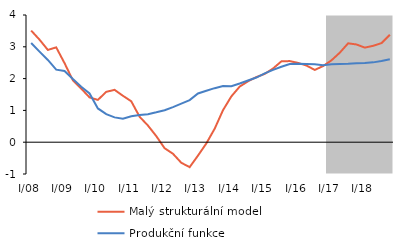
| Category | Malý strukturální model | Produkční funkce |
|---|---|---|
| I/08 | 3.51 | 3.12 |
| II | 3.225 | 2.848 |
| III | 2.902 | 2.586 |
| IV | 2.983 | 2.28 |
| I/09 | 2.486 | 2.239 |
| II | 1.945 | 1.986 |
| III | 1.685 | 1.744 |
| IV | 1.408 | 1.533 |
| I/10 | 1.33 | 1.062 |
| II | 1.584 | 0.881 |
| III | 1.646 | 0.78 |
| IV | 1.46 | 0.735 |
| I/11 | 1.286 | 0.814 |
| II | 0.801 | 0.853 |
| III | 0.524 | 0.882 |
| IV | 0.191 | 0.941 |
| I/12 | -0.19 | 1.006 |
| II | -0.364 | 1.105 |
| III | -0.647 | 1.212 |
| IV | -0.784 | 1.323 |
| I/13 | -0.421 | 1.532 |
| II | -0.039 | 1.618 |
| III | 0.425 | 1.699 |
| IV | 1.007 | 1.769 |
| I/14 | 1.441 | 1.757 |
| II | 1.749 | 1.844 |
| III | 1.916 | 1.941 |
| IV | 2.048 | 2.033 |
| I/15 | 2.147 | 2.163 |
| II | 2.317 | 2.275 |
| III | 2.543 | 2.374 |
| IV | 2.551 | 2.461 |
| I/16 | 2.494 | 2.464 |
| II | 2.411 | 2.46 |
| III | 2.273 | 2.448 |
| IV | 2.394 | 2.423 |
| I/17 | 2.574 | 2.454 |
| II | 2.815 | 2.463 |
| III | 3.11 | 2.466 |
| IV | 3.073 | 2.484 |
| I/18 | 2.974 | 2.487 |
| II | 3.031 | 2.511 |
| III | 3.116 | 2.551 |
| IV | 3.377 | 2.607 |